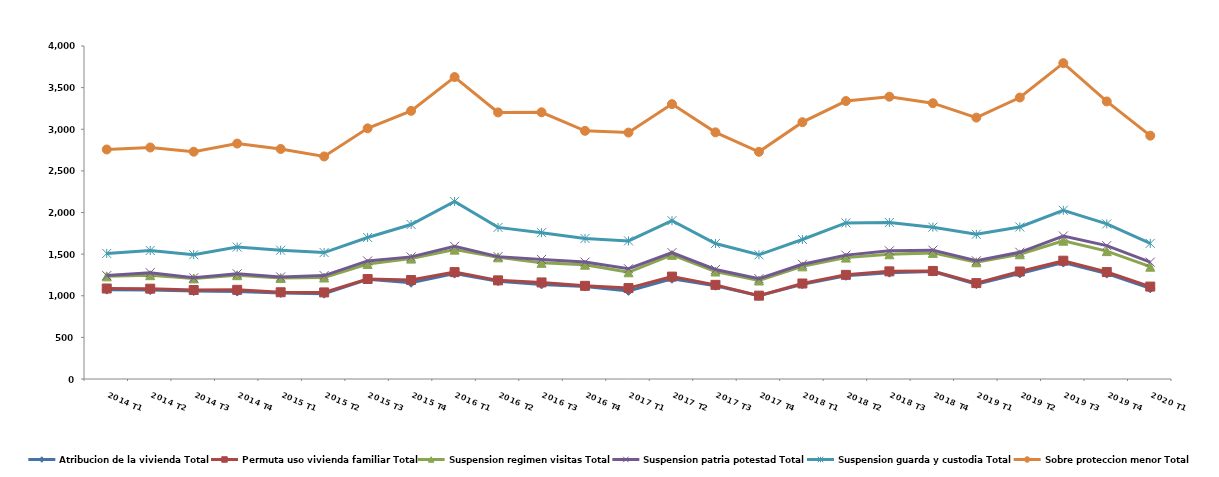
| Category | Atribucion de la vivienda Total | Permuta uso vivienda familiar Total | Suspension regimen visitas Total | Suspension patria potestad Total | Suspension guarda y custodia Total | Sobre proteccion menor Total |
|---|---|---|---|---|---|---|
| 2014 T1 | 1073 | 14 | 146 | 9 | 266 | 1249 |
| 2014 T2 | 1068 | 17 | 162 | 30 | 267 | 1237 |
| 2014 T3 | 1056 | 13 | 139 | 7 | 278 | 1237 |
| 2014 T4 | 1050 | 21 | 176 | 16 | 322 | 1243 |
| 2015 T1 | 1033 | 9 | 171 | 13 | 321 | 1216 |
| 2015 T2 | 1025 | 15 | 179 | 23 | 277 | 1154 |
| 2015 T3 | 1198 | 3 | 181 | 36 | 282 | 1311 |
| 2015 T4 | 1156 | 33 | 257 | 21 | 389 | 1365 |
| 2016 T1 | 1266 | 18 | 270 | 40 | 539 | 1494 |
| 2016 T2 | 1175 | 10 | 276 | 9 | 351 | 1381 |
| 2016 T3 | 1136 | 24 | 235 | 41 | 322 | 1446 |
| 2016 T4 | 1112 | 7 | 254 | 31 | 284 | 1293 |
| 2017 T1 | 1058 | 34 | 190 | 42 | 335 | 1301 |
| 2017 T2 | 1204 | 26 | 261 | 27 | 384 | 1400 |
| 2017 T3 | 1120 | 11 | 160 | 25 | 312 | 1335 |
| 2017 T4 | 1000 | 1 | 182 | 22 | 287 | 1237 |
| 2018 T1 | 1137 | 10 | 206 | 25 | 298 | 1409 |
| 2018 T2 | 1239 | 12 | 207 | 30 | 387 | 1464 |
| 2018 T3 | 1277 | 16 | 205 | 42 | 340 | 1511 |
| 2018 T4 | 1290 | 8 | 217 | 33 | 276 | 1489 |
| 2019 T1 | 1139 | 13 | 250 | 18 | 318 | 1402 |
| 2019 T2 | 1268 | 23 | 207 | 24 | 304 | 1555 |
| 2019 T3 | 1398 | 23 | 240 | 57 | 309 | 1767 |
| 2019 T4 | 1266 | 19 | 251 | 66 | 261 | 1471 |
| 2020 T1 | 1089 | 21 | 239 | 55 | 225 | 1294 |